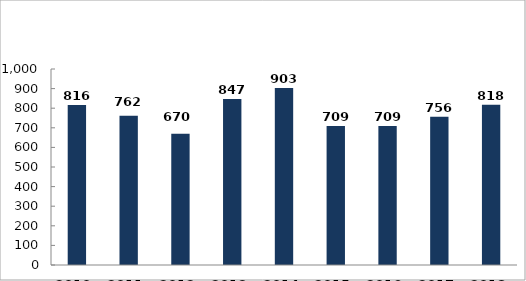
| Category | Szándékos bűncselekmény elkövetésén tettenérés miatti elfogások száma |
|---|---|
| 2010. év | 816 |
| 2011. év | 762 |
| 2012. év | 670 |
| 2013. év | 847 |
| 2014. év | 903 |
| 2015. év | 709 |
| 2016. év | 709 |
| 2017. év | 756 |
| 2018. év | 818 |